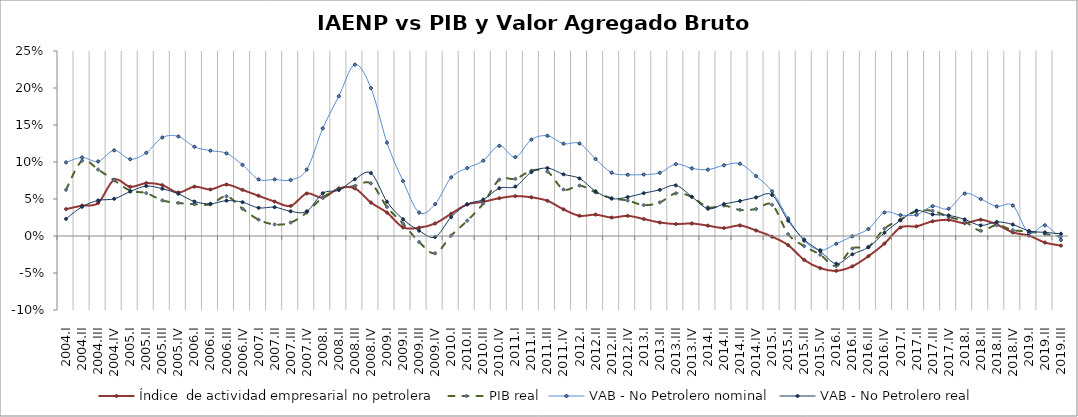
| Category | Índice  de actividad empresarial no petrolera | PIB real | VAB - No Petrolero nominal | VAB - No Petrolero real |
|---|---|---|---|---|
| 2004.I | 0.036 | 0.062 | 0.099 | 0.023 |
| 2004.II | 0.041 | 0.102 | 0.106 | 0.039 |
| 2004.III | 0.045 | 0.09 | 0.101 | 0.048 |
| 2004.IV | 0.076 | 0.075 | 0.116 | 0.05 |
| 2005.I | 0.066 | 0.061 | 0.104 | 0.06 |
| 2005.II | 0.071 | 0.058 | 0.112 | 0.067 |
| 2005.III | 0.069 | 0.048 | 0.133 | 0.064 |
| 2005.IV | 0.059 | 0.045 | 0.134 | 0.057 |
| 2006.I | 0.067 | 0.043 | 0.121 | 0.047 |
| 2006.II | 0.063 | 0.043 | 0.115 | 0.044 |
| 2006.III | 0.07 | 0.054 | 0.112 | 0.048 |
| 2006.IV | 0.062 | 0.037 | 0.096 | 0.046 |
| 2007.I | 0.054 | 0.022 | 0.076 | 0.038 |
| 2007.II | 0.047 | 0.016 | 0.076 | 0.039 |
| 2007.III | 0.041 | 0.018 | 0.076 | 0.033 |
| 2007.IV | 0.057 | 0.032 | 0.09 | 0.033 |
| 2008.I | 0.052 | 0.052 | 0.146 | 0.058 |
| 2008.II | 0.064 | 0.063 | 0.189 | 0.062 |
| 2008.III | 0.064 | 0.068 | 0.232 | 0.077 |
| 2008.IV | 0.045 | 0.071 | 0.2 | 0.085 |
| 2009.I | 0.032 | 0.039 | 0.126 | 0.046 |
| 2009.II | 0.012 | 0.017 | 0.074 | 0.023 |
| 2009.III | 0.011 | -0.008 | 0.032 | 0.007 |
| 2009.IV | 0.017 | -0.023 | 0.043 | -0.001 |
| 2010.I | 0.03 | 0.001 | 0.079 | 0.025 |
| 2010.II | 0.043 | 0.021 | 0.092 | 0.043 |
| 2010.III | 0.046 | 0.044 | 0.102 | 0.049 |
| 2010.IV | 0.051 | 0.076 | 0.122 | 0.065 |
| 2011.I | 0.054 | 0.077 | 0.107 | 0.067 |
| 2011.II | 0.052 | 0.088 | 0.13 | 0.086 |
| 2011.III | 0.048 | 0.087 | 0.135 | 0.092 |
| 2011.IV | 0.036 | 0.063 | 0.125 | 0.083 |
| 2012.I | 0.027 | 0.068 | 0.125 | 0.078 |
| 2012.II | 0.029 | 0.059 | 0.104 | 0.06 |
| 2012.III | 0.025 | 0.051 | 0.085 | 0.05 |
| 2012.IV | 0.027 | 0.048 | 0.083 | 0.053 |
| 2013.I | 0.023 | 0.042 | 0.083 | 0.058 |
| 2013.II | 0.018 | 0.045 | 0.085 | 0.062 |
| 2013.III | 0.016 | 0.058 | 0.097 | 0.068 |
| 2013.IV | 0.017 | 0.053 | 0.091 | 0.053 |
| 2014.I | 0.014 | 0.039 | 0.09 | 0.037 |
| 2014.II | 0.011 | 0.041 | 0.096 | 0.043 |
| 2014.III | 0.014 | 0.035 | 0.098 | 0.047 |
| 2014.IV | 0.007 | 0.036 | 0.081 | 0.052 |
| 2015.I | -0.001 | 0.042 | 0.06 | 0.055 |
| 2015.II | -0.012 | 0.002 | 0.024 | 0.021 |
| 2015.III | -0.032 | -0.014 | -0.006 | -0.005 |
| 2015.IV | -0.043 | -0.025 | -0.019 | -0.02 |
| 2016.I | -0.047 | -0.04 | -0.011 | -0.037 |
| 2016.II | -0.041 | -0.017 | 0 | -0.025 |
| 2016.III | -0.027 | -0.015 | 0.009 | -0.015 |
| 2016.IV | -0.01 | 0.01 | 0.032 | 0.004 |
| 2017.I | 0.012 | 0.022 | 0.028 | 0.021 |
| 2017.II | 0.013 | 0.033 | 0.029 | 0.034 |
| 2017.III | 0.02 | 0.034 | 0.04 | 0.029 |
| 2017.IV | 0.022 | 0.026 | 0.037 | 0.028 |
| 2018.I | 0.017 | 0.02 | 0.057 | 0.022 |
| 2018.II | 0.022 | 0.007 | 0.05 | 0.014 |
| 2018.III | 0.016 | 0.015 | 0.04 | 0.019 |
| 2018.IV | 0.005 | 0.008 | 0.041 | 0.016 |
| 2019.I | 0.001 | 0.006 | 0.004 | 0.007 |
| 2019.II | -0.009 | 0.003 | 0.014 | 0.005 |
| 2019.III | -0.013 | -0.001 | -0.005 | 0.003 |